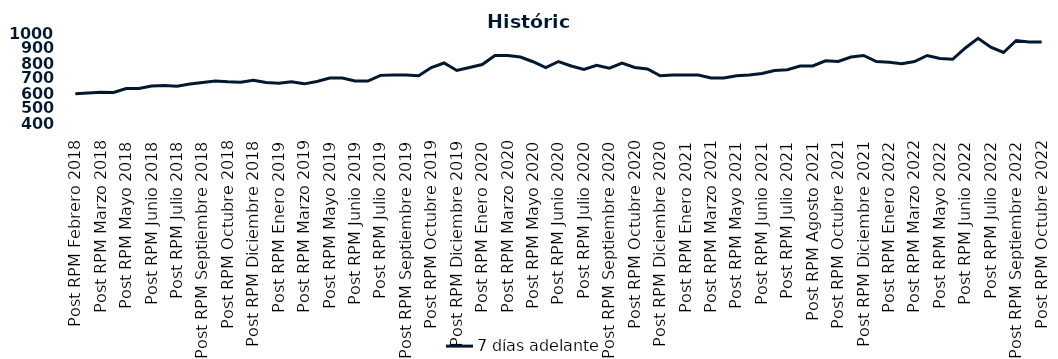
| Category | 7 días adelante  |
|---|---|
| Post RPM Febrero 2018 | 595 |
| Pre RPM Marzo 2018 | 600 |
| Post RPM Marzo 2018 | 605 |
| Pre RPM Mayo 2018 | 603 |
| Post RPM Mayo 2018 | 630 |
| Pre RPM Junio 2018 | 630 |
| Post RPM Junio 2018 | 646.5 |
| Pre RPM Julio 2018 | 650 |
| Post RPM Julio 2018 | 645 |
| Pre RPM Septiembre 2018 | 660 |
| Post RPM Septiembre 2018 | 670 |
| Pre RPM Octubre 2018 | 680 |
| Post RPM Octubre 2018 | 675 |
| Pre RPM Diciembre 2018 | 672.5 |
| Post RPM Diciembre 2018 | 685 |
| Pre RPM Enero 2019 | 670 |
| Post RPM Enero 2019 | 665 |
| Pre RPM Marzo 2019 | 675 |
| Post RPM Marzo 2019 | 661 |
| Pre RPM Mayo 2019 | 677 |
| Post RPM Mayo 2019 | 700 |
| Pre RPM Junio 2019 | 700.5 |
| Post RPM Junio 2019 | 680 |
| Pre RPM Julio 2019 | 680 |
| Post RPM Julio 2019 | 717.5 |
| Pre RPM Septiembre 2019 | 720 |
| Post RPM Septiembre 2019 | 720 |
| Pre RPM Octubre 2019 | 715 |
| Post RPM Octubre 2019 | 770 |
| Pre RPM Diciembre 2019 | 800 |
| Post RPM Diciembre 2019 | 750 |
| Pre RPM Enero 2020 | 770 |
| Post RPM Enero 2020 | 790 |
| Pre RPM Marzo 2020 | 850 |
| Post RPM Marzo 2020 | 850 |
| Pre RPM Mayo 2020 | 840 |
| Post RPM Mayo 2020 | 808.5 |
| Pre RPM Junio 2020 | 770 |
| Post RPM Junio 2020 | 810 |
| Pre RPM Julio 2020 | 780 |
| Post RPM Julio 2020 | 757 |
| Pre RPM Septiembre 2020 | 785 |
| Post RPM Septiembre 2020 | 765 |
| Pre RPM Octubre 2020 | 800 |
| Post RPM Octubre 2020 | 770 |
| Pre RPM Diciembre 2020 | 760 |
| Post RPM Diciembre 2020 | 715 |
| Pre RPM Enero 2021 | 720 |
| Post RPM Enero 2021 | 720 |
| Pre RPM Marzo 2021 | 720 |
| Post RPM Marzo 2021 | 700 |
| Pre RPM Mayo 2021 | 700 |
| Post RPM Mayo 2021 | 715 |
| Pre RPM Junio 2021 | 720 |
| Post RPM Junio 2021 | 730 |
| Pre RPM Julio 2021 | 750 |
| Post RPM Julio 2021 | 755 |
| Pre RPM Agosto 2021 | 780 |
| Post RPM Agosto 2021 | 780 |
| Pre RPM Octubre 2021 | 815 |
| Post RPM Octubre 2021 | 810 |
| Pre RPM Diciembre 2021 | 840 |
| Post RPM Diciembre 2021 | 850 |
| Pre RPM Enero 2022 | 810 |
| Post RPM Enero 2022 | 805 |
| Pre RPM Marzo 2022 | 795 |
| Post RPM Marzo 2022 | 810 |
| Pre RPM Mayo 2022 | 850 |
| Post RPM Mayo 2022 | 830 |
| Pre RPM Junio 2022 | 825 |
| Post RPM Junio 2022 | 900 |
| Pre RPM Julio 2022 | 965 |
| Post RPM Julio 2022 | 905 |
| Pre RPM Septiembre 2022 | 870 |
| Post RPM Septiembre 2022 | 950 |
| Pre RPM Octubre 2022 | 940 |
| Post RPM Octubre 2022 | 940 |